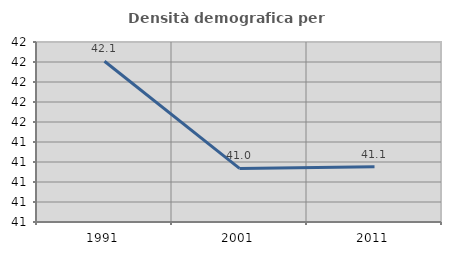
| Category | Densità demografica |
|---|---|
| 1991.0 | 42.108 |
| 2001.0 | 41.036 |
| 2011.0 | 41.052 |